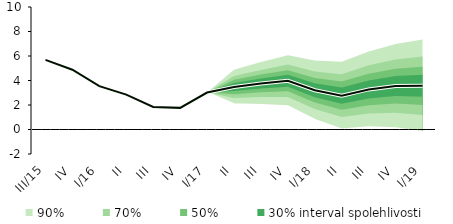
| Category | linka | Centerline |
|---|---|---|
| III/15 | 5.688 | 5.688 |
| IV | 4.881 | 4.881 |
| I/16 | 3.541 | 3.541 |
| II | 2.848 | 2.848 |
| III | 1.844 | 1.844 |
| IV | 1.766 | 1.766 |
| I/17 | 3.015 | 3.015 |
| II | 3.47 | 3.47 |
| III | 3.756 | 3.756 |
| IV | 3.98 | 3.98 |
| I/18 | 3.208 | 3.208 |
| II | 2.765 | 2.765 |
| III | 3.272 | 3.272 |
| IV | 3.542 | 3.542 |
| I/19 | 3.567 | 3.567 |